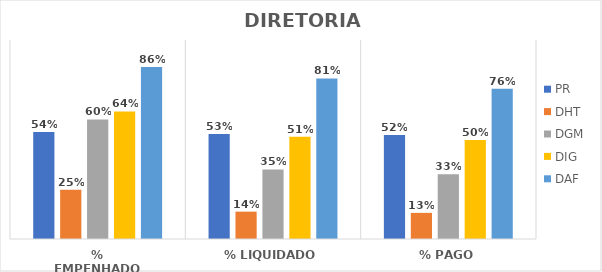
| Category | PR | DHT | DGM | DIG | DAF |
|---|---|---|---|---|---|
| % EMPENHADO | 0.538 | 0.248 | 0.601 | 0.641 | 0.865 |
| % LIQUIDADO | 0.527 | 0.137 | 0.35 | 0.514 | 0.807 |
| % PAGO | 0.523 | 0.131 | 0.326 | 0.498 | 0.756 |